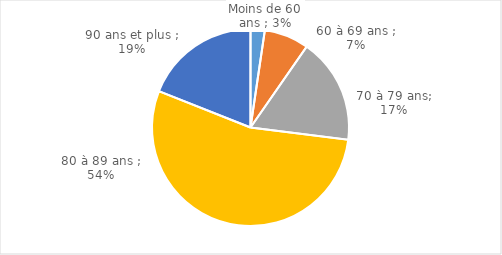
| Category | Series 0 |
|---|---|
| Moins de 60 ans  | 0.023 |
| 60 à 69 ans  | 0.073 |
| 70 à 79 ans | 0.173 |
| 80 à 89 ans  | 0.54 |
| 90 ans et plus  | 0.19 |